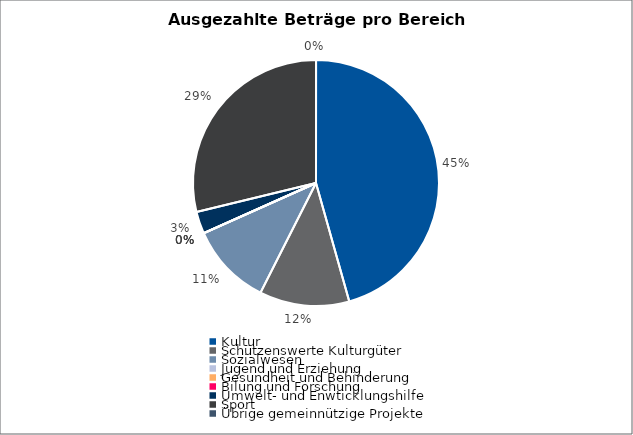
| Category | Series 0 |
|---|---|
| Kultur | 6277608 |
| Schützenswerte Kulturgüter | 1625497 |
| Sozialwesen | 1491945 |
| Jugend und Erziehung | 0 |
| Gesundheit und Behinderung | 0 |
| Bilung und Forschung | 0 |
| Umwelt- und Enwticklungshilfe | 399789 |
| Sport | 3959868 |
| Übrige gemeinnützige Projekte | 0 |